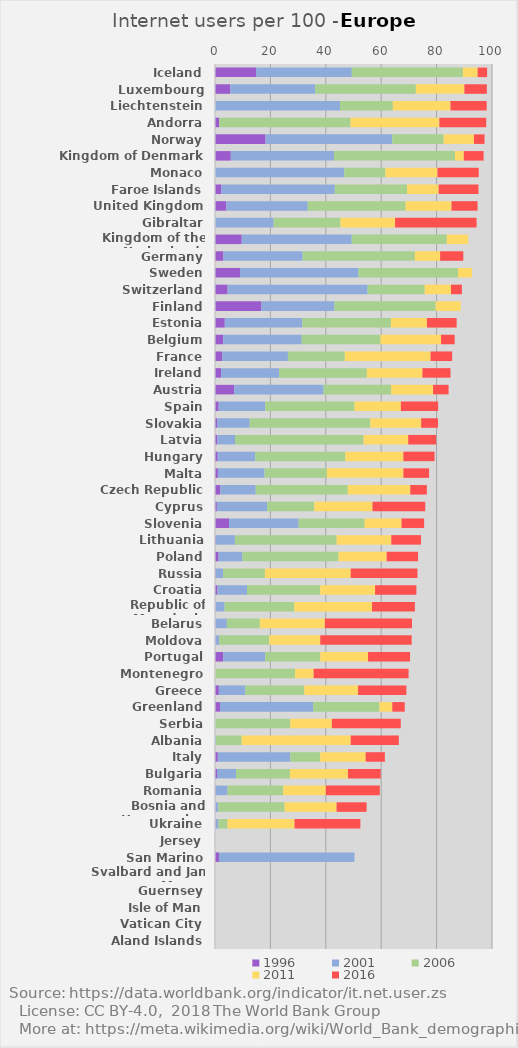
| Category | 1996 | 2001 | 2006 | 2011 | 2016 |
|---|---|---|---|---|---|
| Iceland | 14.81 | 34.58 | 40.12 | 5.31 | 3.42 |
| Luxembourg | 5.55 | 30.61 | 36.35 | 17.52 | 8.11 |
| Liechtenstein | 0 | 45.12 | 19.09 | 20.79 | 13.09 |
| Andorra | 1.53 | 0 | 47.41 | 32.06 | 16.93 |
| Norway | 18.25 | 45.75 | 18.55 | 10.94 | 3.81 |
| Kingdom of Denmark | 5.71 | 37.25 | 43.69 | 3.16 | 7.16 |
| Monaco | 0 | 46.65 | 14.83 | 18.82 | 14.91 |
| Faroe Islands | 2.32 | 40.93 | 26.11 | 11.37 | 14.38 |
| United Kingdom | 4.12 | 29.36 | 35.34 | 16.56 | 9.4 |
| Gibraltar | 0 | 21.17 | 24.13 | 19.7 | 29.44 |
| Kingdom of the Netherlands | 9.65 | 39.72 | 34.33 | 7.72 | 0 |
| Germany | 3.05 | 28.6 | 40.51 | 9.11 | 8.38 |
| Sweden | 9.04 | 42.73 | 35.99 | 5.01 | 0 |
| Switzerland | 4.55 | 50.55 | 20.6 | 9.49 | 3.94 |
| Finland | 16.78 | 26.33 | 36.55 | 9.05 | 0 |
| Estonia | 3.53 | 28 | 31.98 | 12.99 | 10.74 |
| Belgium | 2.97 | 28.32 | 28.43 | 21.89 | 4.91 |
| France | 2.58 | 23.75 | 20.54 | 30.95 | 7.8 |
| Ireland | 2.2 | 20.94 | 31.68 | 20.07 | 10.12 |
| Austria | 6.91 | 32.28 | 24.41 | 15.14 | 5.58 |
| Spain | 1.33 | 16.82 | 32.22 | 16.72 | 13.47 |
| Slovakia | 0.78 | 11.75 | 43.55 | 18.36 | 6.04 |
| Latvia | 0.81 | 6.41 | 46.41 | 16.12 | 10.09 |
| Hungary | 0.97 | 13.56 | 32.53 | 20.96 | 11.24 |
| Malta | 1.05 | 16.83 | 22.53 | 27.61 | 9.27 |
| Czech Republic | 1.94 | 12.76 | 33.23 | 22.56 | 5.99 |
| Cyprus | 0.67 | 18.15 | 17.01 | 21.03 | 19.04 |
| Slovenia | 5.07 | 25.11 | 23.83 | 13.33 | 8.16 |
| Lithuania | 0.28 | 6.9 | 36.72 | 19.74 | 10.74 |
| Poland | 1.3 | 8.6 | 34.68 | 17.37 | 11.35 |
| Russia | 0.27 | 2.67 | 15.08 | 30.98 | 24.09 |
| Croatia | 0.86 | 10.7 | 26.42 | 19.81 | 14.91 |
| Republic of Macedonia | 0.08 | 3.39 | 25.15 | 28.08 | 15.46 |
| Belarus | 0.03 | 4.27 | 11.9 | 23.45 | 31.46 |
| Moldova | 0 | 1.49 | 18.13 | 18.38 | 33 |
| Portugal | 2.98 | 15.11 | 19.92 | 17.24 | 15.17 |
| Montenegro | 0 | 0 | 28.9 | 6.71 | 34.27 |
| Greece | 1.4 | 9.54 | 21.31 | 19.4 | 17.44 |
| Greenland | 1.8 | 33.66 | 23.9 | 4.64 | 4.5 |
| Serbia | 0 | 0 | 27.2 | 15 | 24.86 |
| Albania | 0.03 | 0.3 | 9.28 | 39.39 | 17.36 |
| Italy | 1.02 | 26.2 | 10.77 | 16.4 | 6.93 |
| Bulgaria | 0.73 | 6.88 | 19.48 | 20.89 | 11.85 |
| Romania | 0.22 | 4.32 | 20.12 | 15.35 | 19.49 |
| Bosnia and Herzegovina | 0.02 | 1.18 | 23.92 | 18.77 | 10.85 |
| Ukraine | 0.1 | 1.14 | 3.27 | 24.2 | 23.77 |
| Jersey | 0 | 0 | 0 | 0 | 0 |
| San Marino | 1.43 | 48.91 | 0 | 0 | 0 |
| Svalbard and Jan Mayen | 0 | 0 | 0 | 0 | 0 |
| Guernsey | 0 | 0 | 0 | 0 | 0 |
| Isle of Man | 0 | 0 | 0 | 0 | 0 |
| Vatican City | 0 | 0 | 0 | 0 | 0 |
| Aland Islands | 0 | 0 | 0 | 0 | 0 |